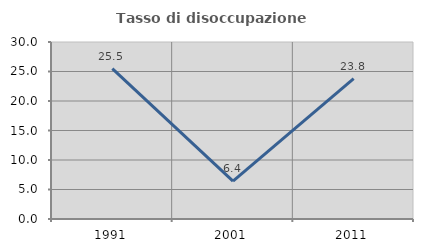
| Category | Tasso di disoccupazione giovanile  |
|---|---|
| 1991.0 | 25.49 |
| 2001.0 | 6.41 |
| 2011.0 | 23.81 |